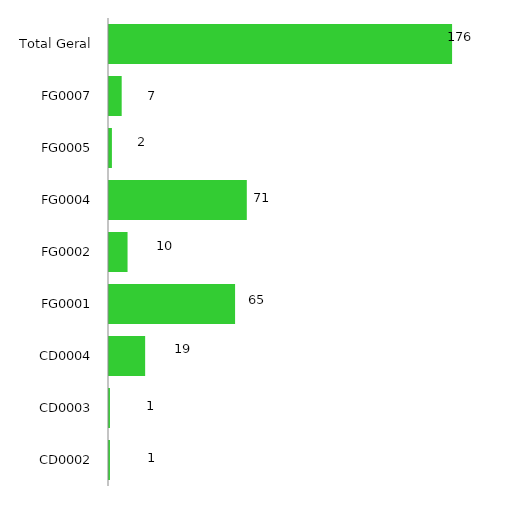
| Category | 2016 |
|---|---|
| CD0002 | 1 |
| CD0003 | 1 |
| CD0004 | 19 |
| FG0001 | 65 |
| FG0002 | 10 |
| FG0004 | 71 |
| FG0005 | 2 |
| FG0007 | 7 |
| Total Geral | 176 |